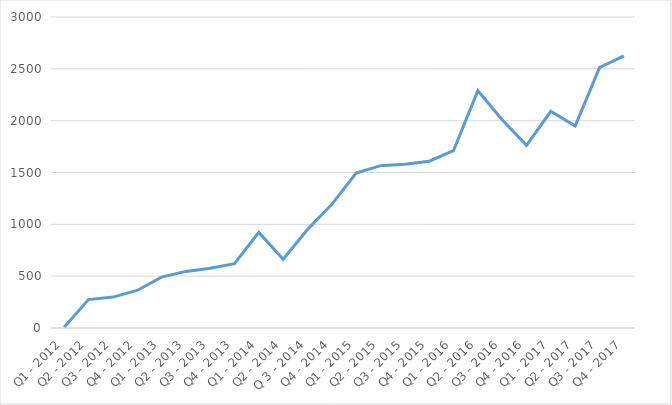
| Category | Anfragen |
|---|---|
| Q1 - 2012 | 8 |
| Q2 - 2012 | 274 |
| Q3 - 2012 | 298 |
| Q4 - 2012 | 362 |
| Q1 - 2013 | 491 |
| Q2 - 2013 | 546 |
| Q3 - 2013 | 576 |
| Q4 - 2013 | 621 |
| Q1 - 2014 | 922 |
| Q2 - 2014 | 663 |
| Q 3 - 2014 | 950 |
| Q4 - 2014 | 1193 |
| Q1 - 2015 | 1494 |
| Q2 - 2015 | 1566 |
| Q3 - 2015 | 1579 |
| Q4 - 2015 | 1609 |
| Q1 - 2016 | 1712 |
| Q2 - 2016 | 2289 |
| Q3 - 2016 | 2009 |
| Q4 - 2016 | 1762 |
| Q1 - 2017 | 2090 |
| Q2 - 2017 | 1949 |
| Q3 - 2017 | 2512 |
| Q4 - 2017 | 2624 |